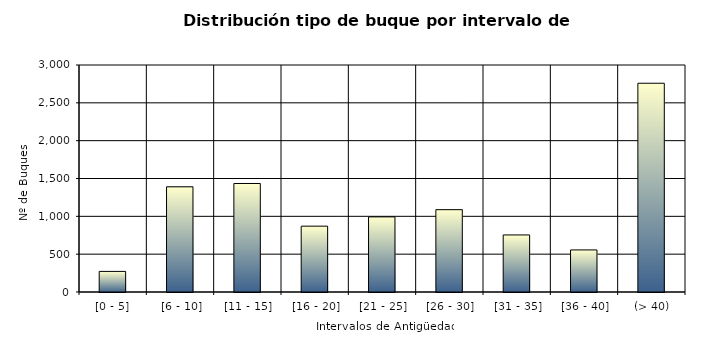
| Category | Series 0 |
|---|---|
| [0 - 5] | 272 |
|  [6 - 10] | 1390 |
|  [11 - 15] | 1434 |
|  [16 - 20] | 870 |
|  [21 - 25] | 993 |
|  [26 - 30] | 1088 |
|  [31 - 35] | 754 |
|  [36 - 40] | 556 |
|  (> 40) | 2759 |